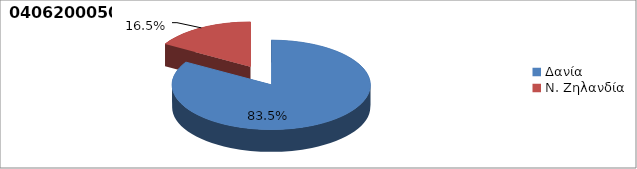
| Category | Series 0 |
|---|---|
| Δανία | 0.835 |
| Ν. Ζηλανδία | 0.165 |